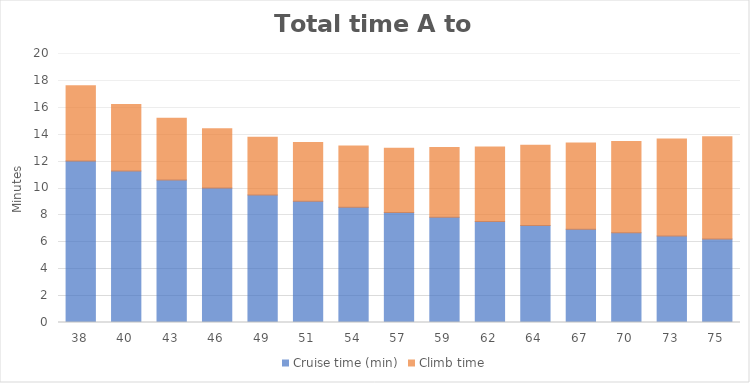
| Category | Cruise time (min) | Climb time |
|---|---|---|
| 38 | 12.008 | 5.598 |
| 40 | 11.257 | 4.957 |
| 43 | 10.595 | 4.597 |
| 46 | 10.006 | 4.406 |
| 49 | 9.48 | 4.297 |
| 51 | 9.006 | 4.374 |
| 54 | 8.577 | 4.554 |
| 57 | 8.187 | 4.771 |
| 59 | 7.831 | 5.172 |
| 62 | 7.505 | 5.54 |
| 64 | 7.205 | 5.971 |
| 67 | 6.928 | 6.415 |
| 70 | 6.671 | 6.782 |
| 73 | 6.433 | 7.206 |
| 75 | 6.211 | 7.601 |